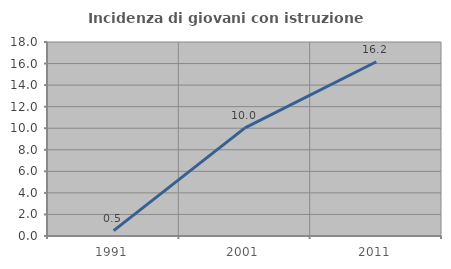
| Category | Incidenza di giovani con istruzione universitaria |
|---|---|
| 1991.0 | 0.493 |
| 2001.0 | 10.037 |
| 2011.0 | 16.17 |